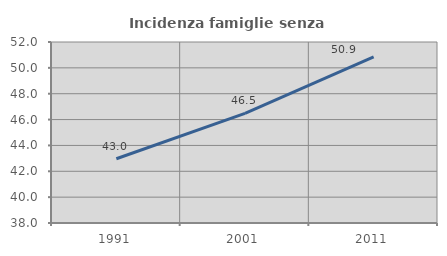
| Category | Incidenza famiglie senza nuclei |
|---|---|
| 1991.0 | 42.967 |
| 2001.0 | 46.475 |
| 2011.0 | 50.852 |